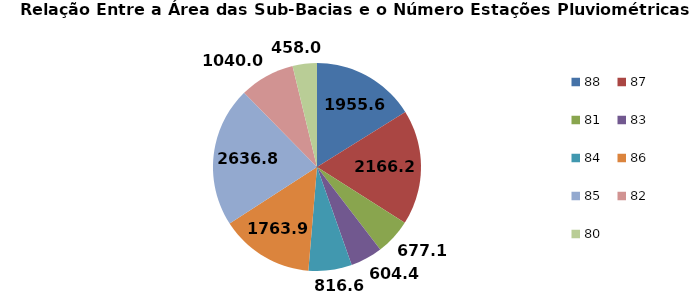
| Category | Área (km2)/N° de Estaçõesb,c,d,e,f |
|---|---|
| 88.0 | 1955.572 |
| 87.0 | 2166.245 |
| 81.0 | 677.129 |
| 83.0 | 604.445 |
| 84.0 | 816.644 |
| 86.0 | 1763.928 |
| 85.0 | 2636.768 |
| 82.0 | 1039.987 |
| 80.0 | 458.015 |